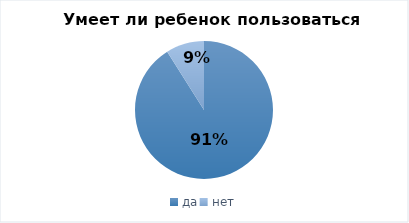
| Category | Series 0 |
|---|---|
| да | 600 |
| нет | 59 |